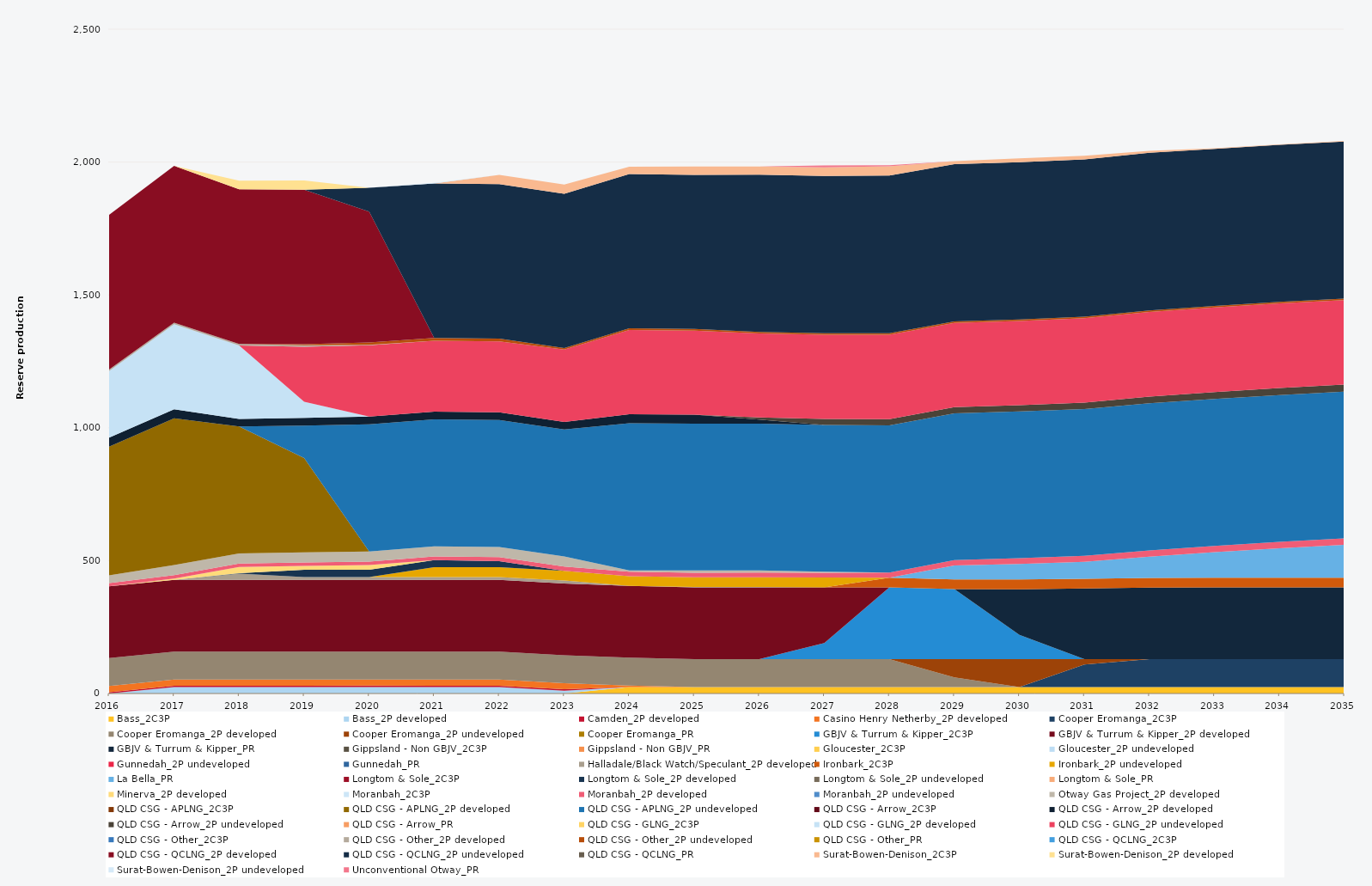
| Category | Bass_2C3P | Bass_2P developed | Camden_2P developed | Casino Henry Netherby_2P developed | Cooper Eromanga_2C3P | Cooper Eromanga_2P developed | Cooper Eromanga_2P undeveloped | Cooper Eromanga_PR | GBJV & Turrum & Kipper_2C3P | GBJV & Turrum & Kipper_2P developed | GBJV & Turrum & Kipper_PR | Gippsland - Non GBJV_2C3P | Gippsland - Non GBJV_PR | Gloucester_2C3P | Gloucester_2P undeveloped | Gunnedah_2P undeveloped | Gunnedah_PR | Halladale/Black Watch/Speculant_2P developed | Ironbark_2C3P | Ironbark_2P undeveloped | La Bella_PR | Longtom & Sole_2C3P | Longtom & Sole_2P developed | Longtom & Sole_2P undeveloped | Longtom & Sole_PR | Minerva_2P developed | Moranbah_2C3P | Moranbah_2P developed | Moranbah_2P undeveloped | Otway Gas Project_2P developed | QLD CSG - APLNG_2C3P | QLD CSG - APLNG_2P developed | QLD CSG - APLNG_2P undeveloped | QLD CSG - Arrow_2C3P | QLD CSG - Arrow_2P developed | QLD CSG - Arrow_2P undeveloped | QLD CSG - Arrow_PR | QLD CSG - GLNG_2C3P | QLD CSG - GLNG_2P developed | QLD CSG - GLNG_2P undeveloped | QLD CSG - Other_2C3P | QLD CSG - Other_2P developed | QLD CSG - Other_2P undeveloped | QLD CSG - Other_PR | QLD CSG - QCLNG_2C3P | QLD CSG - QCLNG_2P developed | QLD CSG - QCLNG_2P undeveloped | QLD CSG - QCLNG_PR | Surat-Bowen-Denison_2C3P | Surat-Bowen-Denison_2P developed | Surat-Bowen-Denison_2P undeveloped | Unconventional Otway_PR |
|---|---|---|---|---|---|---|---|---|---|---|---|---|---|---|---|---|---|---|---|---|---|---|---|---|---|---|---|---|---|---|---|---|---|---|---|---|---|---|---|---|---|---|---|---|---|---|---|---|---|---|---|---|
| 2016 | 0 | 0 | 5 | 23.12 | 0 | 105 | 0 | 0 | 0 | 270 | 0 | 0 | 0 | 0 | 0 | 0 | 0 | 0 | 0 | 0 | 0 | 0 | 0 | 0 | 0 | 0 | 0 | 12.867 | 0 | 28.323 | 0 | 484.728 | 0 | 0 | 34.038 | 0 | 0 | 0 | 250.546 | 0 | 0 | 5.856 | 0 | 0 | 0 | 581.813 | 0 | 0 | 0 | 0 | 0 | 0 |
| 2017 | 0 | 24.455 | 5 | 23.12 | 0 | 105 | 0 | 0 | 0 | 270 | 0 | 0 | 0 | 0 | 0 | 0 | 0 | 0 | 0 | 0 | 0 | 0 | 0 | 0 | 0 | 5.142 | 0 | 12.873 | 0 | 38 | 0 | 552.245 | 0 | 0 | 33.945 | 0 | 0 | 0 | 320.282 | 0 | 0 | 5.84 | 0 | 0 | 0 | 589.717 | 0 | 0 | 0 | 0 | 0 | 0 |
| 2018 | 0 | 24.455 | 5 | 23.12 | 0 | 105 | 0 | 0 | 0 | 270 | 0 | 0 | 0 | 0 | 0 | 0 | 0 | 23.725 | 0 | 0 | 0 | 0 | 1.143 | 0 | 0 | 23.725 | 0 | 13.04 | 0 | 38 | 0 | 477.621 | 0 | 0 | 28.853 | 0 | 0 | 0 | 276.018 | 0 | 0 | 5.84 | 0 | 0 | 0 | 582.419 | 0 | 0 | 0 | 31.885 | 0 | 0 |
| 2019 | 0 | 24.455 | 5 | 23.12 | 0 | 105 | 0 | 0 | 0 | 270 | 0 | 0 | 0 | 0 | 0 | 0 | 0 | 10.95 | 0 | 0 | 0 | 0 | 27.28 | 0 | 0 | 14.204 | 0 | 12.81 | 0 | 38 | 0 | 354.956 | 122.665 | 0 | 28.853 | 0 | 0 | 0 | 60.455 | 206.847 | 0 | 5.84 | 4.563 | 0 | 0 | 581.184 | 0 | 0 | 0 | 34.93 | 0 | 0 |
| 2020 | 0 | 24.522 | 5 | 23.12 | 0 | 105 | 0 | 0 | 0 | 270 | 0 | 0 | 0 | 0 | 0 | 0 | 0 | 10.95 | 0 | 0 | 0 | 0 | 27.45 | 0 | 0 | 17.679 | 0 | 12.781 | 0 | 38 | 0 | 0 | 478.929 | 0 | 28.932 | 0 | 0 | 0 | 0 | 268.19 | 0 | 1.624 | 8.795 | 0 | 0 | 492.266 | 90.397 | 0 | 0 | 0 | 0 | 0 |
| 2021 | 0 | 24.455 | 5 | 23.12 | 0 | 105 | 0 | 0 | 0 | 270 | 0 | 0 | 0 | 0 | 0 | 0 | 0 | 10.95 | 0 | 36.5 | 0 | 0 | 27.375 | 0 | 0 | 0 | 0 | 13.533 | 0 | 38 | 0 | 0 | 477.621 | 0 | 28.853 | 0 | 0 | 0 | 0 | 267.487 | 0 | 0 | 10.403 | 0 | 0 | 0 | 581.202 | 0 | 0 | 0 | 2 | 0 |
| 2022 | 0 | 24.455 | 5 | 23.12 | 0 | 105 | 0 | 0 | 0 | 270 | 0 | 0 | 0 | 0 | 0 | 0 | 0 | 10.95 | 0 | 36.5 | 0 | 0 | 23.234 | 0 | 0 | 0 | 0 | 15.298 | 0 | 38 | 0 | 0 | 477.621 | 0 | 28.853 | 0 | 0 | 0 | 0 | 267.135 | 0 | 0 | 10.403 | 0 | 0 | 0 | 581.104 | 0 | 34.93 | 0 | 0 | 0 |
| 2023 | 0 | 10.85 | 5 | 23.12 | 0 | 105 | 0 | 0 | 0 | 270 | 0 | 0 | 0 | 0 | 0 | 0 | 0 | 10.95 | 0 | 36.5 | 0 | 0 | 0 | 0 | 0 | 0 | 0 | 16.264 | 0 | 38 | 0 | 0 | 477.621 | 0 | 28.853 | 0 | 0 | 0 | 0 | 271.914 | 0 | 0 | 5.84 | 0 | 0 | 0 | 580.934 | 0 | 34.93 | 0 | 0 | 0 |
| 2024 | 24.522 | 0 | 0 | 5.3 | 0 | 105 | 0 | 0 | 0 | 270 | 0 | 0 | 0 | 0 | 0 | 0 | 0 | 0.208 | 0 | 36.6 | 0 | 0 | 0 | 0 | 0 | 0 | 0 | 16.79 | 0 | 4.734 | 0 | 0 | 553.758 | 0 | 34.038 | 0 | 0 | 0 | 0 | 317.359 | 0 | 0 | 5.856 | 0 | 0 | 0 | 580.592 | 0 | 28.135 | 0 | 0 | 0 |
| 2025 | 24.455 | 0 | 0 | 0 | 0 | 105 | 0 | 0 | 0 | 270 | 0 | 0 | 0 | 0 | 0 | 0 | 0 | 1.569 | 0 | 36.5 | 0 | 0 | 0 | 0 | 0 | 0 | 0 | 17.268 | 0 | 8.148 | 0 | 0 | 552.245 | 0 | 33.945 | 0 | 0 | 0 | 0 | 316.795 | 0 | 0 | 5.84 | 0 | 0 | 0 | 579.884 | 0 | 31.629 | 0 | 0 | 0 |
| 2026 | 24.455 | 0 | 0 | 0 | 0 | 105 | 0 | 0 | 0 | 270 | 0 | 0 | 0 | 0 | 0 | 0 | 0 | 1.402 | 0 | 36.5 | 0 | 0 | 0 | 0 | 0 | 0 | 0 | 17.518 | 0 | 8.61 | 0 | 0 | 552.245 | 0 | 14.785 | 8.056 | 0 | 0 | 0 | 316.693 | 0 | 0 | 5.84 | 0 | 0 | 0 | 591.753 | 0 | 30.324 | 0 | 0 | 0 |
| 2027 | 24.455 | 0 | 0 | 0 | 0 | 105 | 0 | 0 | 60.893 | 209.107 | 0 | 0 | 0 | 0 | 0 | 0 | 0 | 0.347 | 0 | 36.5 | 0 | 0 | 0 | 0 | 0 | 0 | 0 | 18.14 | 0 | 3.792 | 0 | 0 | 552.245 | 0 | 0 | 23.131 | 0 | 0 | 0 | 316.854 | 0 | 0 | 5.84 | 0 | 0 | 0 | 591.693 | 0 | 32.097 | 0 | 0 | 6.965 |
| 2028 | 24.522 | 0 | 0 | 0 | 0 | 105 | 0 | 0 | 270 | 0 | 0 | 0 | 0 | 0 | 0 | 0 | 0 | 0 | 36.2 | 0.4 | 0 | 0 | 0 | 0 | 0 | 0 | 0 | 18.99 | 0 | 0 | 0 | 0 | 553.758 | 0 | 0 | 23.47 | 0 | 0 | 0 | 317.828 | 0 | 0 | 5.856 | 0 | 0 | 0 | 593.234 | 0 | 34.608 | 0 | 0 | 4.035 |
| 2029 | 24.455 | 0 | 0 | 0 | 0 | 36 | 69 | 0 | 263.38 | 0 | 0 | 0 | 0 | 0 | 0 | 0 | 0 | 0 | 36.5 | 0 | 52.6 | 0 | 0 | 0 | 0 | 0 | 0 | 20.344 | 0 | 0 | 0 | 0 | 552.245 | 0 | 0 | 23.353 | 0 | 0 | 0 | 316.897 | 0 | 0 | 5.84 | 0 | 0 | 0 | 591.622 | 0 | 11.001 | 0 | 0 | 0 |
| 2030 | 24.455 | 0 | 0 | 0 | 0 | 0 | 105 | 0 | 91.441 | 0 | 171.565 | 0 | 0 | 0 | 0 | 0 | 0 | 0 | 36.5 | 0 | 58.467 | 0 | 0 | 0 | 0 | 0 | 0 | 21.608 | 0 | 0 | 0 | 0 | 552.245 | 0 | 0 | 23.602 | 0 | 0 | 0 | 317.279 | 0 | 0 | 5.84 | 0 | 0 | 0 | 591.579 | 0 | 14.279 | 0 | 0 | 0 |
| 2031 | 24.455 | 0 | 0 | 0 | 84.418 | 0 | 20.582 | 0 | 0 | 0 | 265.64 | 0 | 0 | 0 | 0 | 0 | 0 | 0 | 36.5 | 0 | 64.27 | 0 | 0 | 0 | 0 | 0 | 0 | 22.555 | 0 | 0 | 0 | 0 | 552.245 | 0 | 0 | 24.176 | 0 | 0 | 0 | 317.559 | 0 | 0 | 5.84 | 0 | 0 | 0 | 591.53 | 0 | 14.392 | 0 | 0 | 0 |
| 2032 | 24.522 | 0 | 0 | 0 | 105 | 0 | 0 | 0 | 0 | 0 | 269.157 | 0 | 0 | 0 | 0 | 0 | 0 | 0 | 36.6 | 0 | 79.643 | 0 | 0 | 0 | 0 | 0 | 0 | 23.473 | 0 | 0 | 0 | 0 | 553.758 | 0 | 0 | 25.27 | 0 | 0 | 0 | 318.687 | 0 | 0 | 5.856 | 0 | 0 | 0 | 593.07 | 0 | 7.723 | 0 | 0 | 0 |
| 2033 | 24.455 | 0 | 0 | 0 | 105 | 0 | 0 | 0 | 0 | 0 | 270 | 0 | 0 | 0 | 0 | 0 | 0 | 0 | 36.5 | 0 | 95.923 | 0 | 0 | 0 | 0 | 0 | 0 | 23.984 | 0 | 0 | 0 | 0 | 552.245 | 0 | 0 | 26.292 | 0 | 0 | 0 | 318.155 | 0 | 0 | 5.84 | 0 | 0 | 0 | 591.435 | 0 | 2.392 | 0 | 0 | 0 |
| 2034 | 24.455 | 0 | 0 | 0 | 105 | 0 | 0 | 0 | 0 | 0 | 270 | 0 | 0 | 0 | 0 | 0 | 0 | 0 | 36.5 | 0 | 110.37 | 0 | 0 | 0 | 0 | 0 | 0 | 24.559 | 0 | 0 | 0 | 0 | 552.245 | 0 | 0 | 26.478 | 0 | 0 | 0 | 318.338 | 0 | 0 | 5.84 | 0 | 0 | 0 | 591.394 | 0 | 1.719 | 0 | 0 | 0 |
| 2035 | 24.455 | 0 | 0 | 0 | 105 | 0 | 0 | 0 | 0 | 0 | 270 | 0 | 0 | 0 | 0 | 0 | 0 | 0 | 36.5 | 0 | 123.371 | 0 | 0 | 0 | 0 | 0 | 0 | 24.812 | 0 | 0 | 0 | 0 | 552.245 | 0 | 0 | 26.393 | 0 | 0 | 0 | 317.822 | 0 | 0 | 5.84 | 0 | 0 | 0 | 591.053 | 0 | 2.539 | 0 | 0 | 0 |